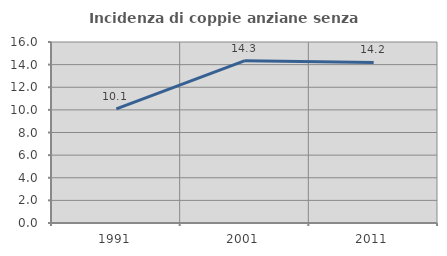
| Category | Incidenza di coppie anziane senza figli  |
|---|---|
| 1991.0 | 10.092 |
| 2001.0 | 14.35 |
| 2011.0 | 14.199 |